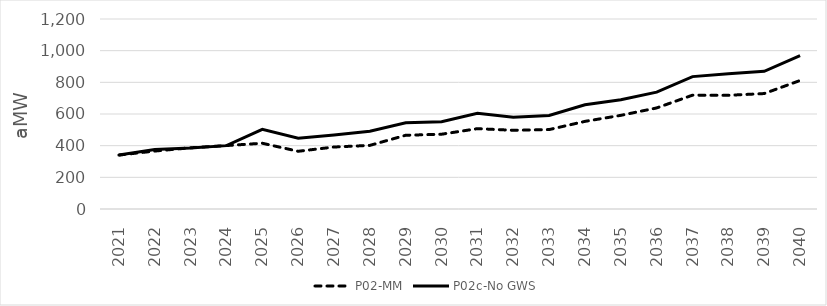
| Category | P02-MM | P02c-No GWS |
|---|---|---|
| 2021.0 | 340.643 | 340.921 |
| 2022.0 | 365.941 | 375.329 |
| 2023.0 | 386.662 | 384.936 |
| 2024.0 | 400.611 | 400.189 |
| 2025.0 | 415.261 | 503.144 |
| 2026.0 | 364.503 | 446.888 |
| 2027.0 | 391.434 | 467.807 |
| 2028.0 | 401.84 | 491.718 |
| 2029.0 | 465.78 | 545.009 |
| 2030.0 | 472.22 | 550.584 |
| 2031.0 | 507.479 | 605.035 |
| 2032.0 | 497.015 | 578.881 |
| 2033.0 | 501.562 | 591.007 |
| 2034.0 | 553.405 | 657.896 |
| 2035.0 | 591.445 | 689.427 |
| 2036.0 | 638.29 | 738.175 |
| 2037.0 | 718.951 | 836.103 |
| 2038.0 | 718.095 | 854.167 |
| 2039.0 | 729.142 | 869.5 |
| 2040.0 | 811.586 | 968.018 |